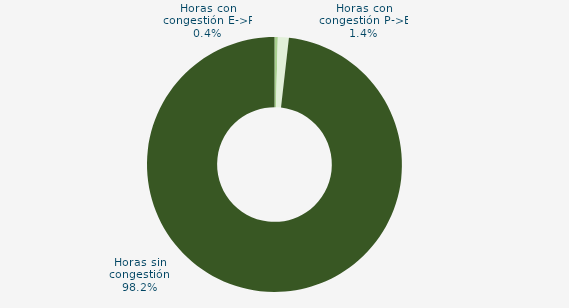
| Category | Horas con congestión E->P |
|---|---|
| Horas con congestión E->P | 0.417 |
| Horas con congestión P->E | 1.389 |
| Horas sin congestión | 98.194 |